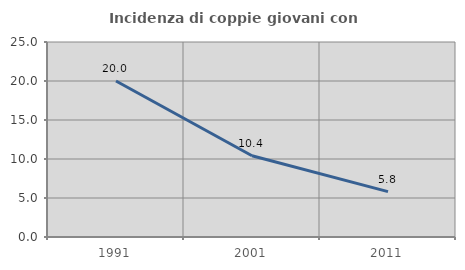
| Category | Incidenza di coppie giovani con figli |
|---|---|
| 1991.0 | 20 |
| 2001.0 | 10.417 |
| 2011.0 | 5.814 |